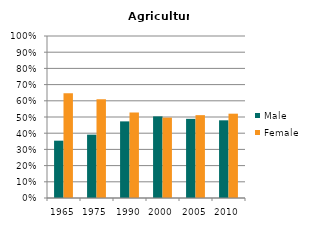
| Category | Male | Female |
|---|---|---|
| 1965.0 | 0.354 | 0.646 |
| 1975.0 | 0.391 | 0.609 |
| 1990.0 | 0.473 | 0.527 |
| 2000.0 | 0.504 | 0.496 |
| 2005.0 | 0.489 | 0.511 |
| 2010.0 | 0.48 | 0.52 |